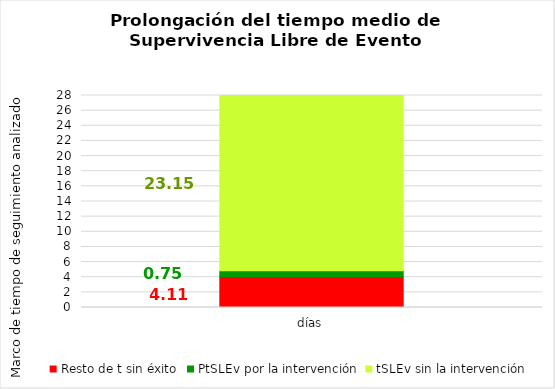
| Category | Resto de t sin éxito | PtSLEv por la intervención | tSLEv sin la intervención |
|---|---|---|---|
| días | 4.107 | 0.747 | 23.146 |